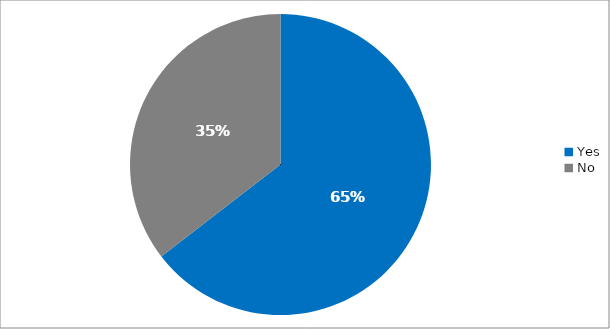
| Category | Responses |
|---|---|
| Yes | 0.645 |
| No | 0.355 |